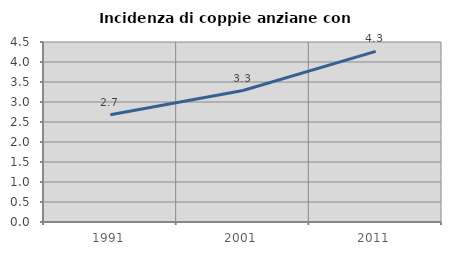
| Category | Incidenza di coppie anziane con figli |
|---|---|
| 1991.0 | 2.683 |
| 2001.0 | 3.287 |
| 2011.0 | 4.266 |